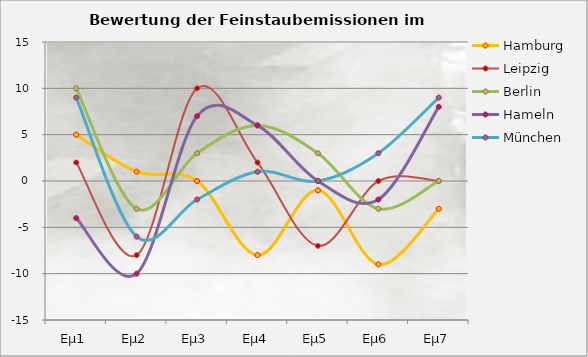
| Category | Hamburg | Leipzig | Berlin | Hameln | München |
|---|---|---|---|---|---|
| Eµ1 | 5 | 2 | 10 | -4 | 9 |
| Eµ2 | 1 | -8 | -3 | -10 | -6 |
| Eµ3 | 0 | 10 | 3 | 7 | -2 |
| Eµ4 | -8 | 2 | 6 | 6 | 1 |
| Eµ5 | -1 | -7 | 3 | 0 | 0 |
| Eµ6 | -9 | 0 | -3 | -2 | 3 |
| Eµ7 | -3 | 0 | 0 | 8 | 9 |